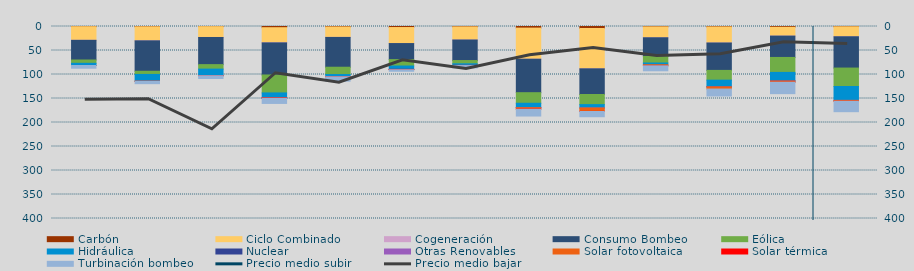
| Category | Carbón | Ciclo Combinado | Cogeneración | Consumo Bombeo | Eólica | Hidráulica | Nuclear | Otras Renovables | Solar fotovoltaica | Solar térmica | Turbinación bombeo |
|---|---|---|---|---|---|---|---|---|---|---|---|
| E | 386 | 28336.3 | 129.1 | 40939.4 | 6907.9 | 4462.9 | 34.4 | 0 | 32.7 | 0 | 5705.4 |
| F | 596.6 | 29112.7 | 204.1 | 63351.9 | 6588.8 | 14242.2 | 0 | 0 | 6.8 | 5.7 | 5009.4 |
| M | 303.5 | 22485.8 | 115.8 | 56511.7 | 9357.1 | 13652.7 | 0 | 45.9 | 36.9 | 12.5 | 5840.6 |
| A | 2494.9 | 31290.063 | 376.8 | 66847.891 | 37361.887 | 10548.549 | 58.3 | 29.1 | 101.167 | 483.9 | 10705.8 |
| M | 916.05 | 21695.666 | 176.35 | 62054.792 | 15250.739 | 4379.143 | 0 | 39.1 | 143.784 | 110.5 | 9070.525 |
| J | 2154.975 | 33372.05 | 35.5 | 33404.025 | 13344.6 | 6713.425 | 395.875 | 16.375 | 385.65 | 221.25 | 3231.725 |
| J | 780.225 | 27400.075 | 8 | 42750.35 | 6759.125 | 3263.775 | 115 | 0 | 90.1 | 206.65 | 4895.275 |
| A | 3351.92 | 64804.475 | 20.75 | 69703.55 | 22031.853 | 9149.525 | 70.975 | 22.5 | 2685.85 | 505.375 | 14186.525 |
| S | 4138.5 | 84055.788 | 26 | 53462.35 | 21071.172 | 6988.753 | 0 | 0.85 | 7069.199 | 219.625 | 10948.251 |
| O | 766.425 | 22723.1 | 23.25 | 38873.508 | 13638.3 | 3548.975 | 0 | 0 | 2254.075 | 15.75 | 10421.953 |
| N | 882.249 | 33437.299 | 73.35 | 57054.7 | 20324.708 | 13802.882 | 172 | 5.375 | 4519.267 | 0 | 14514.075 |
| D | 1625.533 | 18353.308 | 50.675 | 44452.158 | 31169.809 | 17718.259 | 225.525 | 7.75 | 2457.35 | 4.225 | 23848.4 |
| E | 588.4 | 20714.524 | 113.817 | 65169.007 | 38379.733 | 28985.1 | 0 | 1 | 1727.433 | 24.9 | 21766.958 |